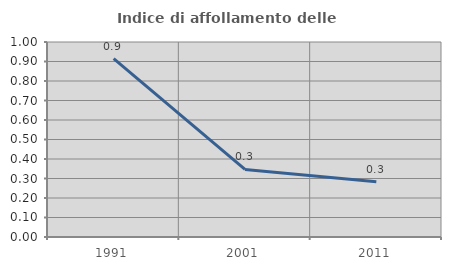
| Category | Indice di affollamento delle abitazioni  |
|---|---|
| 1991.0 | 0.915 |
| 2001.0 | 0.347 |
| 2011.0 | 0.283 |